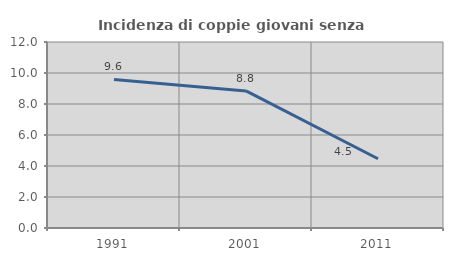
| Category | Incidenza di coppie giovani senza figli |
|---|---|
| 1991.0 | 9.582 |
| 2001.0 | 8.846 |
| 2011.0 | 4.466 |